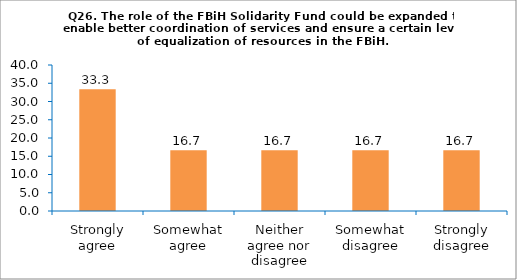
| Category | Series 0 |
|---|---|
| Strongly agree | 33.333 |
| Somewhat agree | 16.667 |
| Neither agree nor disagree | 16.667 |
| Somewhat disagree | 16.667 |
| Strongly disagree | 16.667 |